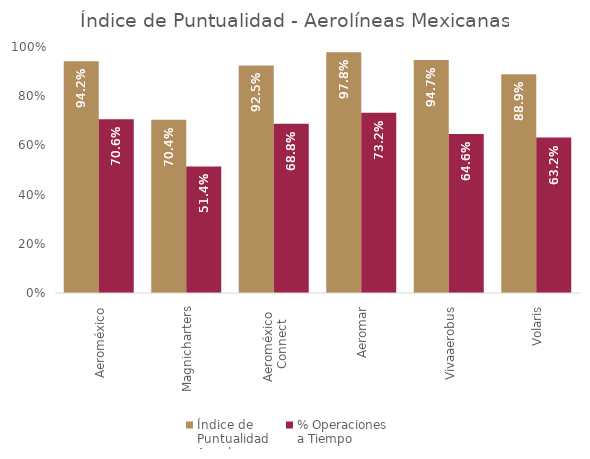
| Category | Índice de 
Puntualidad
Anual | % Operaciones 
a Tiempo |
|---|---|---|
| Aeroméxico | 0.942 | 0.706 |
| Magnicharters | 0.704 | 0.514 |
| Aeroméxico 
Connect | 0.925 | 0.688 |
| Aeromar | 0.978 | 0.732 |
| Vivaaerobus | 0.947 | 0.646 |
| Volaris | 0.889 | 0.632 |